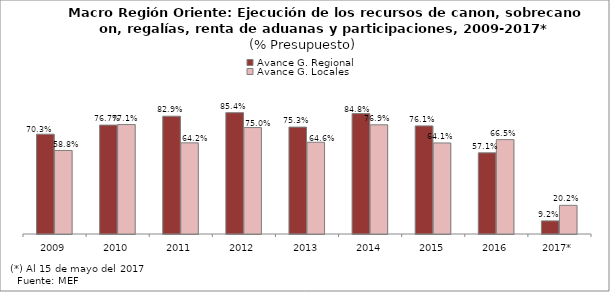
| Category | Avance G. Regional | Avance G. Locales |
|---|---|---|
| 2009 | 0.703 | 0.588 |
| 2010 | 0.767 | 0.771 |
| 2011 | 0.829 | 0.642 |
| 2012 | 0.854 | 0.75 |
| 2013 | 0.753 | 0.646 |
| 2014 | 0.848 | 0.769 |
| 2015 | 0.761 | 0.641 |
| 2016 | 0.571 | 0.665 |
| 2017* | 0.092 | 0.202 |